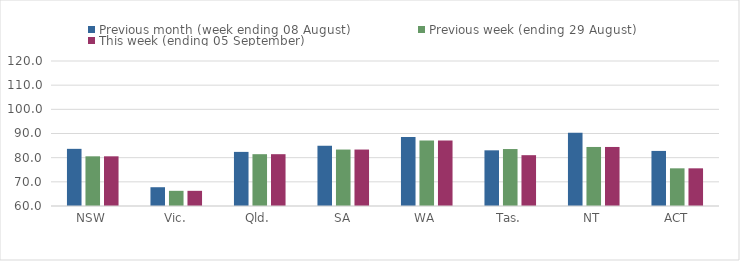
| Category | Previous month (week ending 08 August) | Previous week (ending 29 August) | This week (ending 05 September) |
|---|---|---|---|
| NSW | 83.65 | 80.56 | 80.56 |
| Vic. | 67.77 | 66.28 | 66.28 |
| Qld. | 82.39 | 81.44 | 81.44 |
| SA | 84.93 | 83.36 | 83.36 |
| WA | 88.58 | 87.11 | 87.11 |
| Tas. | 83.04 | 83.57 | 81.03 |
| NT | 90.26 | 84.43 | 84.43 |
| ACT | 82.79 | 75.59 | 75.59 |